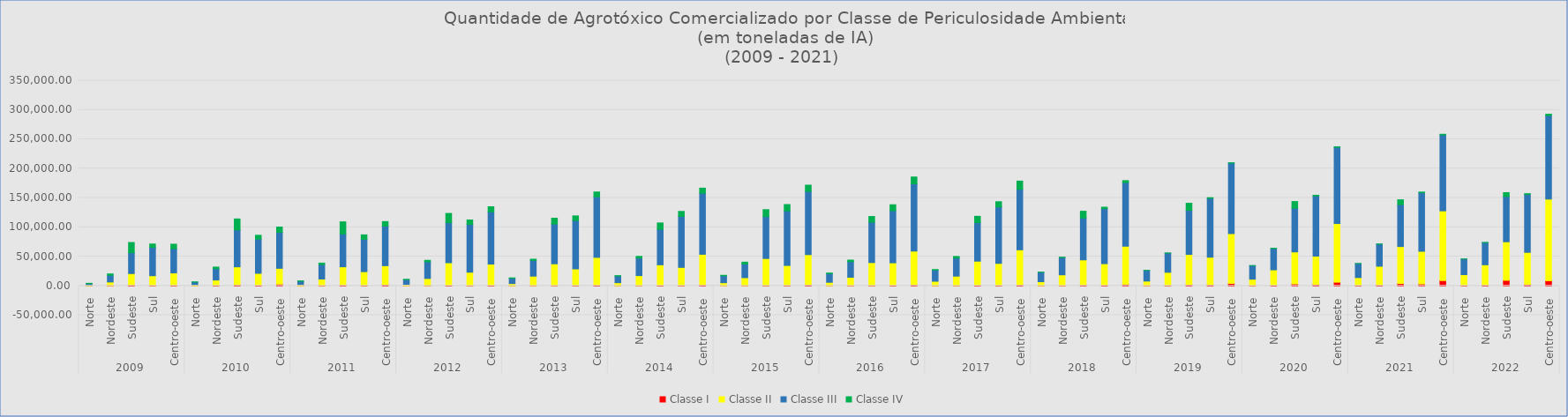
| Category | Classe I | Classe II | Classe III | Classe IV |
|---|---|---|---|---|
| 0 | 36.35 | 953.932 | 2799.853 | 576.792 |
| 1 | 397.864 | 6197.385 | 11391.867 | 2408.553 |
| 2 | 1520.311 | 19457.586 | 35519.049 | 17510.088 |
| 3 | 767.135 | 16541.444 | 48371.365 | 5715.646 |
| 4 | 981.915 | 21091.097 | 41190.943 | 7839.055 |
| 5 | -6.941 | 1476.052 | 4825.8 | 455.017 |
| 6 | 891.223 | 9056.158 | 19269.576 | 2836.456 |
| 7 | 1916.913 | 30575.267 | 62869.728 | 18796.588 |
| 8 | 1154.154 | 20252.344 | 58402.351 | 6485.033 |
| 9 | 2995.57 | 26899.581 | 61415.22 | 8984.642 |
| 10 | 43.027 | 1894.275 | 5946.972 | 642.5 |
| 11 | 604.187 | 11046.837 | 24559.496 | 2612.864 |
| 12 | 1564.807 | 30959.934 | 56049.753 | 20619.312 |
| 13 | 754.606 | 23461.136 | 55189.599 | 7606.858 |
| 14 | 2291.64 | 32117.263 | 67382.694 | 7862.57 |
| 15 | 60.324 | 2427.944 | 8068.352 | 589.779 |
| 16 | 343.98 | 12246.586 | 28387.203 | 2633.252 |
| 17 | 1018.815 | 38426.56 | 68210.915 | 15898.344 |
| 18 | 602.141 | 22674.456 | 81518.599 | 7593.791 |
| 19 | 1013.764 | 36112.335 | 89115.395 | 8757.068 |
| 20 | 101.674 | 3835.159 | 9026.477 | 678.063 |
| 21 | 363.822 | 16225.176 | 26856.946 | 2092.105 |
| 22 | 561.473 | 37071.343 | 67804.393 | 9969.769 |
| 23 | 805.507 | 28121.311 | 82515.756 | 7911.476 |
| 24 | 1279.103 | 47310.306 | 103210.019 | 8332.445 |
| 25 | 102.672 | 5300.656 | 11172.895 | 883.699 |
| 26 | 414.03 | 17073.432 | 29888.571 | 2951.58 |
| 27 | 974.773 | 34947.368 | 60492.2 | 10888.648 |
| 28 | 803.975 | 30660.904 | 86833.984 | 8707.397 |
| 29 | 1589.608 | 52289.192 | 104141.918 | 8636.43 |
| 30 | 94.861 | 5316.981 | 11709.547 | 911.869 |
| 31 | 315.141 | 13673.641 | 23319.735 | 3111.914 |
| 32 | 726.477 | 45932.975 | 71401.429 | 11959.286 |
| 33 | 856.408 | 33963.027 | 92973.64 | 10894.351 |
| 34 | 1851.285 | 51427.068 | 107878.244 | 10629.051 |
| 35 | 128.382 | 5922.748 | 14798.167 | 1068.145 |
| 36 | 588.024 | 14031.992 | 26607.001 | 2759.084 |
| 37 | 746.993 | 38975.225 | 68860.566 | 9766.301 |
| 38 | 978.225 | 38353.076 | 88849.866 | 10169.829 |
| 39 | 1901.864 | 57423.935 | 114596.859 | 11759.487 |
| 40 | 196.828 | 7659.373 | 19033.475 | 951.924 |
| 41 | 476.706 | 16124.832 | 30801.288 | 2793.373 |
| 42 | 1132.209 | 40992.407 | 65655.394 | 10862.397 |
| 43 | 906.433 | 37426.664 | 96156.914 | 9075.077 |
| 44 | 1839.251 | 59676.009 | 103220.796 | 13978.463 |
| 45 | 267.184 | 6824.56 | 16057.57 | 235.423 |
| 46 | 618.392 | 18208.978 | 29457.119 | 593.807 |
| 47 | 1574.152 | 42756.907 | 71396.208 | 11563.373 |
| 48 | 1258.001 | 36581.682 | 93951.61 | 2408.502 |
| 49 | 2767.706 | 64862.231 | 108498.802 | 3402.288 |
| 50 | 430.288 | 7752.884 | 18153.606 | 11.401 |
| 51 | 808.423 | 22264.378 | 32685.354 | 328.123 |
| 52 | 2285.407 | 51297.274 | 75254.836 | 12061.741 |
| 53 | 1992.412 | 46854.794 | 100371.563 | 1248.248 |
| 54 | 4200.646 | 84909.001 | 120171.341 | 783.156 |
| 55 | 608.423 | 10799.094 | 23100.235 | 21.531 |
| 56 | 1106.655 | 26226.881 | 36328.654 | 459.417 |
| 57 | 3355.944 | 54574.639 | 74493.159 | 11413.734 |
| 58 | 2680.043 | 48054.174 | 102593.151 | 1251.36 |
| 59 | 6258.721 | 100223.266 | 129797.13 | 1025.816 |
| 60 | 984.492 | 13136.222 | 23833.611 | 87.82 |
| 61 | 1651.857 | 31812.275 | 37622.436 | 376.612 |
| 62 | 4040.046 | 62994.489 | 71450.634 | 8339.31 |
| 63 | 3322.683 | 55651.89 | 99921.753 | 1144.584 |
| 64 | 9047.295 | 118905.085 | 129451.334 | 1217.948 |
| 65 | 898.347 | 18206.056 | 26708.27 | 72.528 |
| 66 | 1552.786 | 34397.096 | 37765.736 | 357.352 |
| 67 | 9522.784 | 65652.292 | 77151.197 | 6680.947 |
| 68 | 2690.82 | 54480.552 | 98670.684 | 1473.955 |
| 69 | 8834.552 | 139190.766 | 142430.252 | 2387.645 |